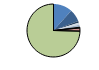
| Category | Series 0 |
|---|---|
| ARRASTRE | 54 |
| CERCO | 35 |
| ATUNEROS CAÑEROS | 5 |
| PALANGRE DE FONDO | 6 |
| PALANGRE DE SUPERFICIE | 6 |
| RASCO | 1 |
| VOLANTA | 2 |
| ARTES FIJAS | 9 |
| ARTES MENORES | 347 |